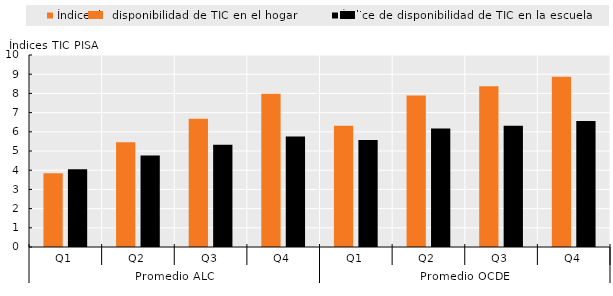
| Category | Índice de disponibilidad de TIC en el hogar  | Índice de disponibilidad de TIC en la escuela  |
|---|---|---|
| 0 | 3.845 | 4.046 |
| 1 | 5.455 | 4.768 |
| 2 | 6.685 | 5.321 |
| 3 | 7.987 | 5.752 |
| 4 | 6.313 | 5.567 |
| 5 | 7.897 | 6.169 |
| 6 | 8.378 | 6.319 |
| 7 | 8.866 | 6.561 |